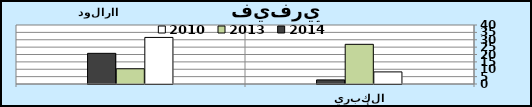
| Category | 2010 | 2013 | 2014 |
|---|---|---|---|
| 0 | 8.204 | 26.897 | 2.772 |
| 1 | 31.576 | 10.337 | 20.789 |